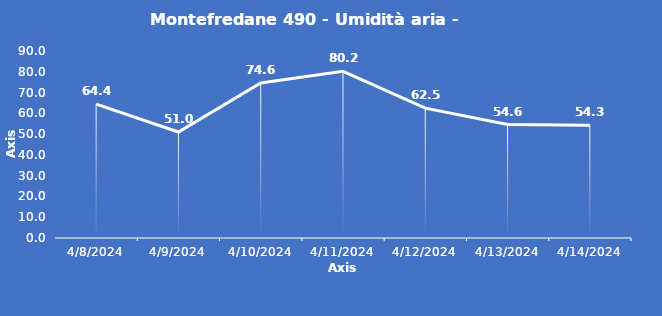
| Category | Montefredane 490 - Umidità aria - Grezzo (%) |
|---|---|
| 4/8/24 | 64.4 |
| 4/9/24 | 51 |
| 4/10/24 | 74.6 |
| 4/11/24 | 80.2 |
| 4/12/24 | 62.5 |
| 4/13/24 | 54.6 |
| 4/14/24 | 54.3 |